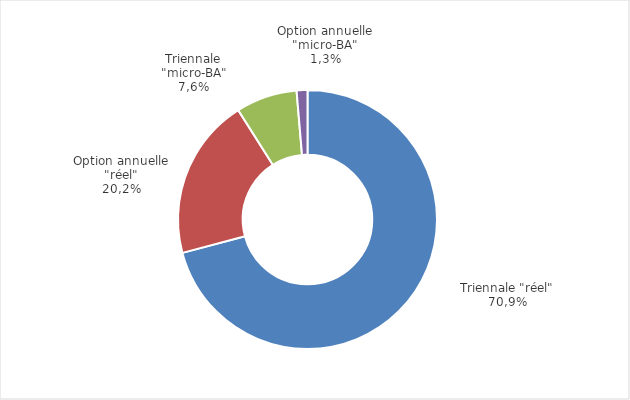
| Category | Series 0 |
|---|---|
| Triennale "réel" | 5731 |
| Option annuelle "réel" | 1631 |
| Triennale "micro-BA" | 618 |
| Option annuelle "micro-BA" | 109 |